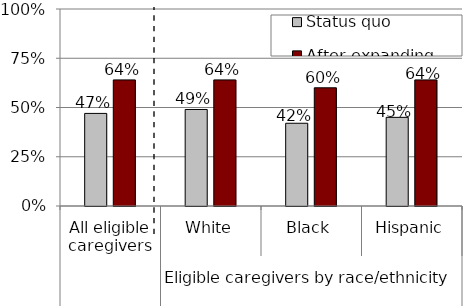
| Category | Status quo | After expanding eligibility |
|---|---|---|
| 0 | 0.47 | 0.64 |
| 1 | 0.49 | 0.64 |
| 2 | 0.42 | 0.6 |
| 3 | 0.45 | 0.64 |